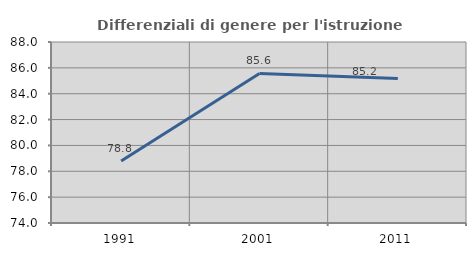
| Category | Differenziali di genere per l'istruzione superiore |
|---|---|
| 1991.0 | 78.789 |
| 2001.0 | 85.572 |
| 2011.0 | 85.176 |